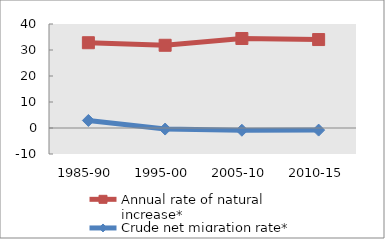
| Category | Annual rate of natural increase* | Crude net migration rate* |
|---|---|---|
| 1985-90 | 32.798 | 2.899 |
| 1995-00 | 31.816 | -0.406 |
| 2005-10 | 34.426 | -0.861 |
| 2010-15 | 34.017 | -0.809 |